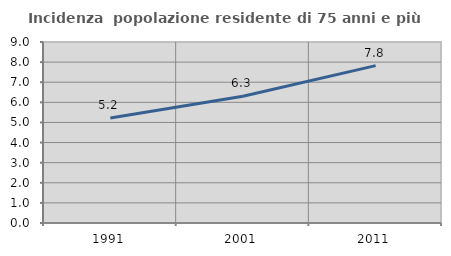
| Category | Incidenza  popolazione residente di 75 anni e più |
|---|---|
| 1991.0 | 5.221 |
| 2001.0 | 6.298 |
| 2011.0 | 7.827 |